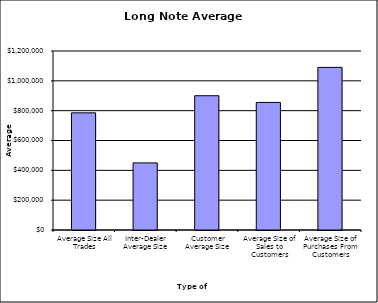
| Category | Security Type |
|---|---|
| Average Size All Trades | 785442.303 |
| Inter-Dealer Average Size | 449868.401 |
| Customer Average Size | 900123.567 |
| Average Size of Sales to Customers | 855294.431 |
| Average Size of Purchases From Customers | 1090283.523 |